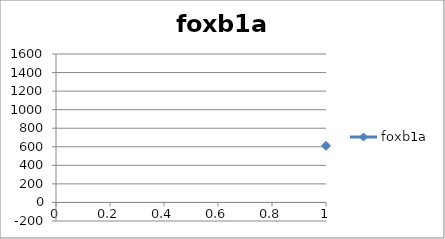
| Category | foxb1a |
|---|---|
| 0 | 610 |
| 1 | 80 |
| 2 | 436 |
| 3 | 1408 |
| 4 | 143 |
| 5 | 23 |
| 6 | 82 |
| 7 | 4 |
| 8 | 14 |
| 9 | 1 |
| 10 | 1 |